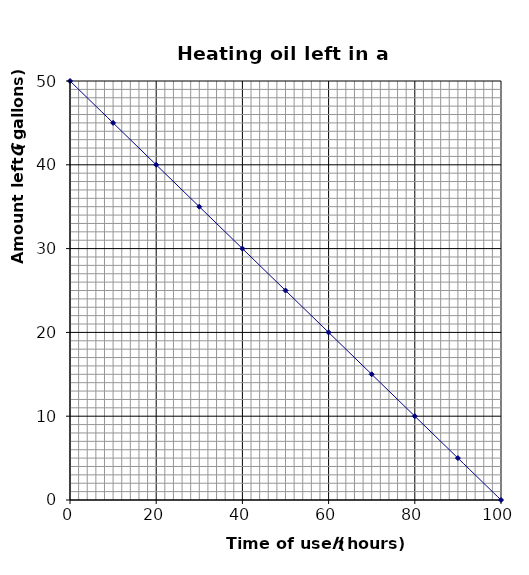
| Category | Series 0 |
|---|---|
| 0.0 | 50 |
| 10.0 | 45 |
| 20.0 | 40 |
| 30.0 | 35 |
| 40.0 | 30 |
| 50.0 | 25 |
| 60.0 | 20 |
| 70.0 | 15 |
| 80.0 | 10 |
| 90.0 | 5 |
| 100.0 | 0 |